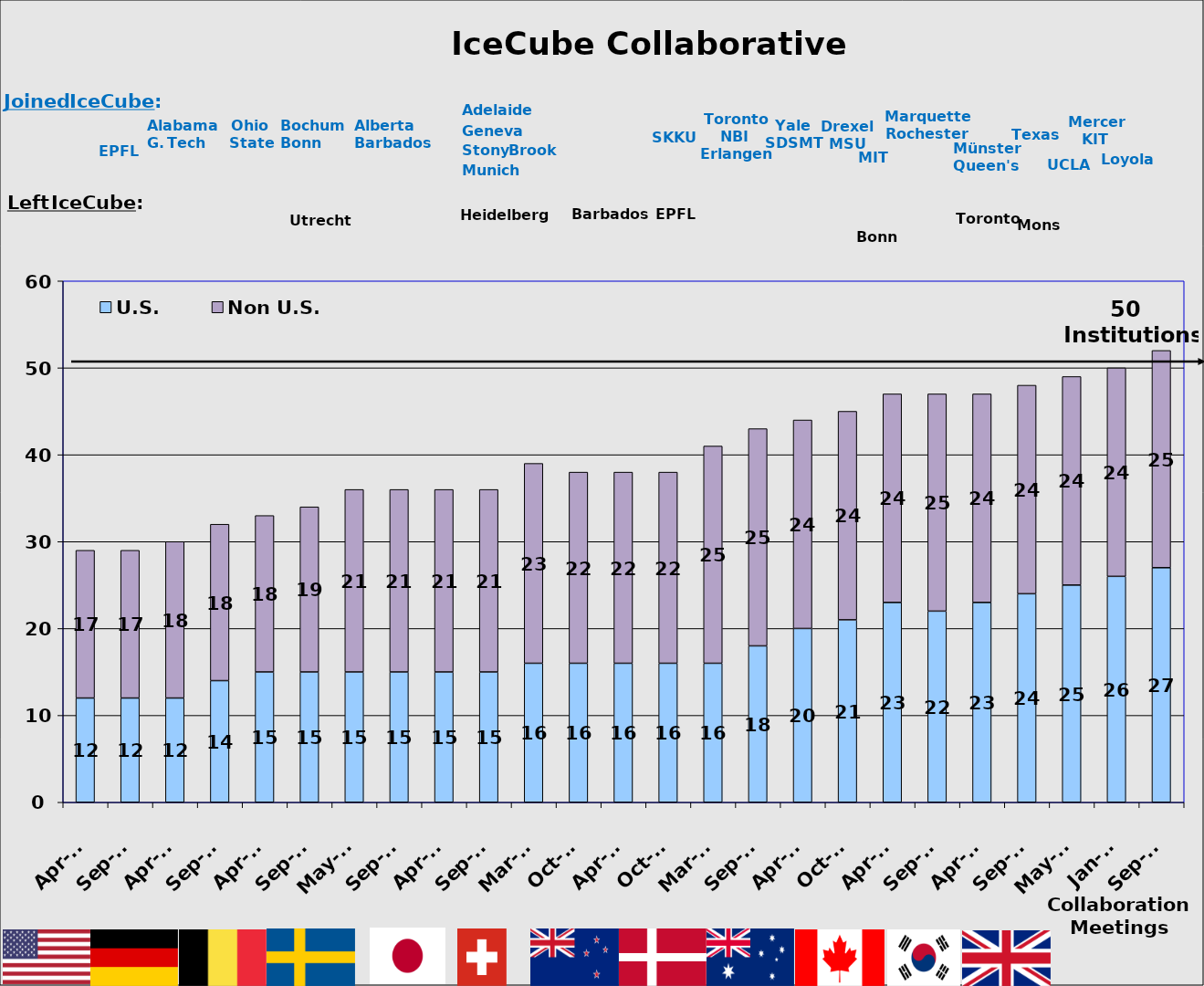
| Category | U.S. | Non U.S. |
|---|---|---|
| Apr-07 | 12 | 17 |
| Sep-07 | 12 | 17 |
| Apr-08 | 12 | 18 |
| Sep-08 | 14 | 18 |
| Apr-09 | 15 | 18 |
| Sep-09 | 15 | 19 |
| May-10 | 15 | 21 |
| Sep-10 | 15 | 21 |
| Apr-11 | 15 | 21 |
| Sep-11 | 15 | 21 |
| Mar-12 | 16 | 23 |
| Oct-12 | 16 | 22 |
| Apr-13 | 16 | 22 |
| Oct-13 | 16 | 22 |
| Mar-14 | 16 | 25 |
| Sep-14 | 18 | 25 |
| Apr-15 | 20 | 24 |
| Oct-15 | 21 | 24 |
| Apr-16 | 23 | 24 |
| Sep-16 | 22 | 25 |
| Apr-17 | 23 | 24 |
| Sep-17 | 24 | 24 |
| May-18 | 25 | 24 |
| Jan-19 | 26 | 24 |
| Sep-19 | 27 | 25 |